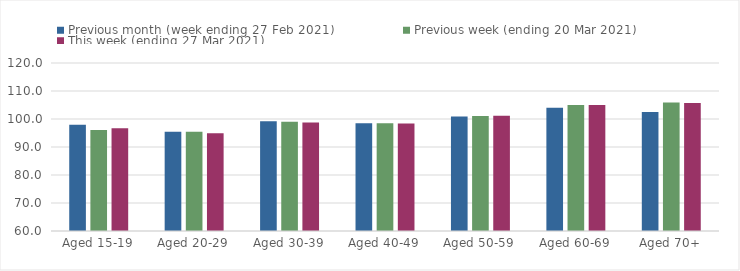
| Category | Previous month (week ending 27 Feb 2021) | Previous week (ending 20 Mar 2021) | This week (ending 27 Mar 2021) |
|---|---|---|---|
| Aged 15-19 | 97.94 | 96.09 | 96.73 |
| Aged 20-29 | 95.49 | 95.45 | 94.94 |
| Aged 30-39 | 99.21 | 98.98 | 98.73 |
| Aged 40-49 | 98.45 | 98.51 | 98.42 |
| Aged 50-59 | 100.87 | 101.09 | 101.16 |
| Aged 60-69 | 103.99 | 104.98 | 105.02 |
| Aged 70+ | 102.46 | 105.86 | 105.71 |